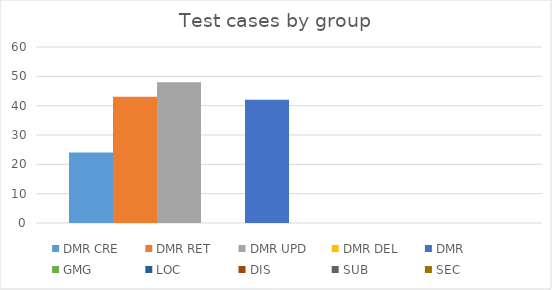
| Category | DMR | GMG | LOC | DIS | SUB | SEC |
|---|---|---|---|---|---|---|
| 0 | 42 | 0 | 0 | 0 | 0 | 0 |